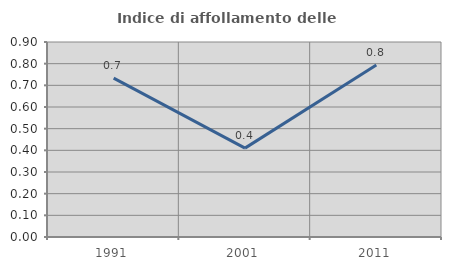
| Category | Indice di affollamento delle abitazioni  |
|---|---|
| 1991.0 | 0.733 |
| 2001.0 | 0.41 |
| 2011.0 | 0.794 |